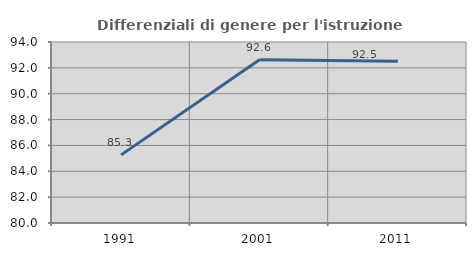
| Category | Differenziali di genere per l'istruzione superiore |
|---|---|
| 1991.0 | 85.269 |
| 2001.0 | 92.623 |
| 2011.0 | 92.517 |